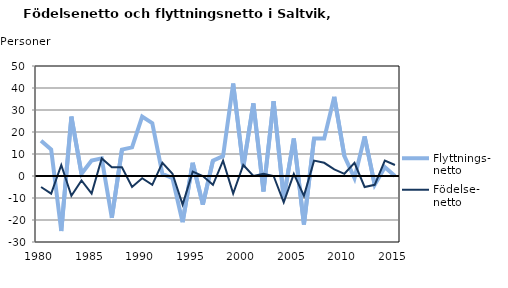
| Category | Flyttnings- netto | Födelse- netto |
|---|---|---|
| 1980.0 | 16 | -5 |
| 1981.0 | 12 | -8 |
| 1982.0 | -25 | 5 |
| 1983.0 | 27 | -9 |
| 1984.0 | 1 | -2 |
| 1985.0 | 7 | -8 |
| 1986.0 | 8 | 8 |
| 1987.0 | -19 | 4 |
| 1988.0 | 12 | 4 |
| 1989.0 | 13 | -5 |
| 1990.0 | 27 | -1 |
| 1991.0 | 24 | -4 |
| 1992.0 | 1 | 6 |
| 1993.0 | -1 | 1 |
| 1994.0 | -21 | -13 |
| 1995.0 | 6 | 2 |
| 1996.0 | -13 | 0 |
| 1997.0 | 7 | -4 |
| 1998.0 | 9 | 7 |
| 1999.0 | 42 | -8 |
| 2000.0 | 4 | 5 |
| 2001.0 | 33 | 0 |
| 2002.0 | -7 | 1 |
| 2003.0 | 34 | 0 |
| 2004.0 | -10 | -12 |
| 2005.0 | 17 | 1 |
| 2006.0 | -22 | -9 |
| 2007.0 | 17 | 7 |
| 2008.0 | 17 | 6 |
| 2009.0 | 36 | 3 |
| 2010.0 | 9 | 1 |
| 2011.0 | -1 | 6 |
| 2012.0 | 18 | -5 |
| 2013.0 | -4 | -4 |
| 2014.0 | 4 | 7 |
| 2015.0 | 0 | 5 |